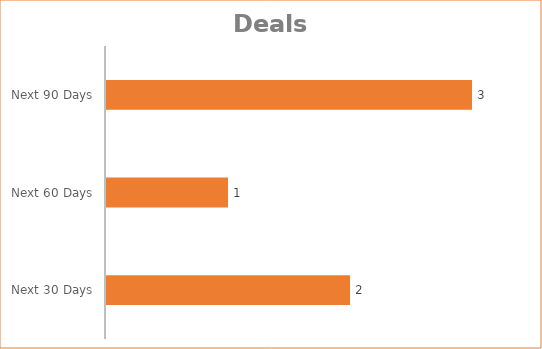
| Category | Estimated |
|---|---|
| Next 30 Days | 2 |
| Next 60 Days | 1 |
| Next 90 Days | 3 |